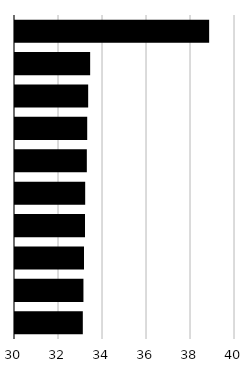
| Category | Combined Score |
|---|---|
| 0 | 38.825 |
| 1 | 33.416 |
| 2 | 33.326 |
| 3 | 33.282 |
| 4 | 33.265 |
| 5 | 33.19 |
| 6 | 33.182 |
| 7 | 33.136 |
| 8 | 33.111 |
| 9 | 33.082 |